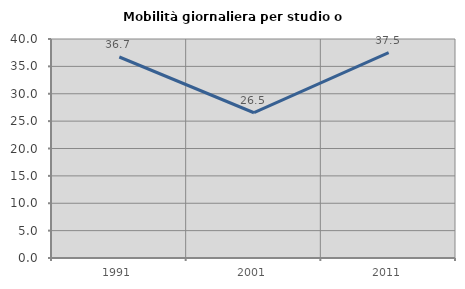
| Category | Mobilità giornaliera per studio o lavoro |
|---|---|
| 1991.0 | 36.713 |
| 2001.0 | 26.531 |
| 2011.0 | 37.5 |